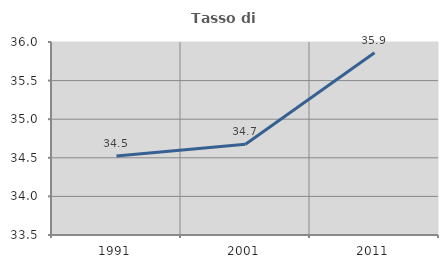
| Category | Tasso di occupazione   |
|---|---|
| 1991.0 | 34.522 |
| 2001.0 | 34.676 |
| 2011.0 | 35.86 |